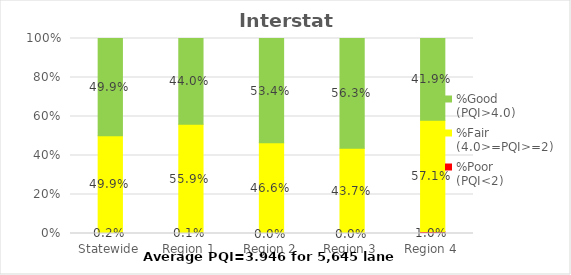
| Category | %Poor
(PQI<2) | %Fair
(4.0>=PQI>=2) | %Good
(PQI>4.0) |
|---|---|---|---|
| Statewide | 0.002 | 0.499 | 0.499 |
| Region 1 | 0.001 | 0.559 | 0.44 |
| Region 2 | 0 | 0.466 | 0.534 |
| Region 3 | 0 | 0.437 | 0.563 |
| Region 4 | 0.01 | 0.571 | 0.419 |